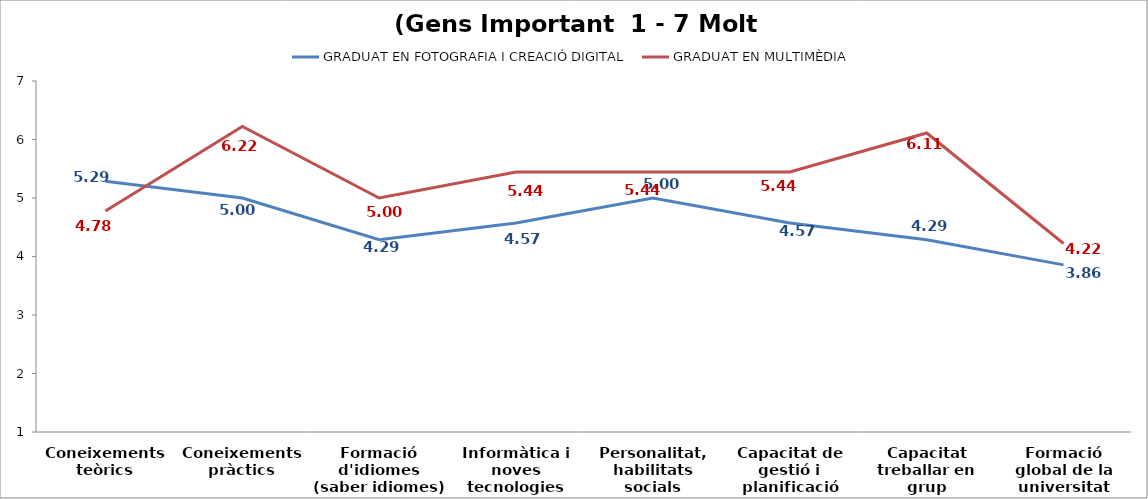
| Category | GRADUAT EN FOTOGRAFIA I CREACIÓ DIGITAL | GRADUAT EN MULTIMÈDIA |
|---|---|---|
| Coneixements teòrics | 5.286 | 4.778 |
| Coneixements pràctics | 5 | 6.222 |
| Formació d'idiomes (saber idiomes) | 4.286 | 5 |
| Informàtica i noves tecnologies | 4.571 | 5.444 |
| Personalitat, habilitats socials | 5 | 5.444 |
| Capacitat de gestió i planificació | 4.571 | 5.444 |
| Capacitat treballar en grup | 4.286 | 6.111 |
| Formació global de la universitat | 3.857 | 4.222 |